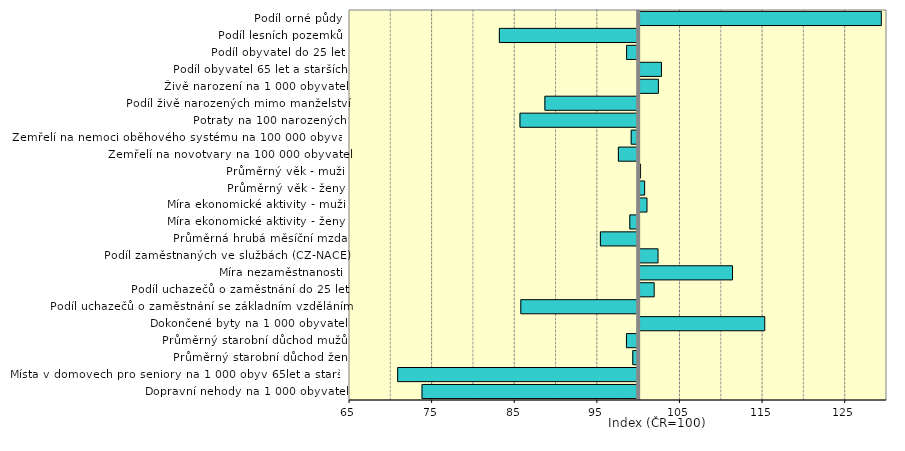
| Category | Series 0 |
|---|---|
| Dopravní nehody na 1 000 obyvatel | 73.778 |
| Místa v domovech pro seniory na 1 000 obyv 65let a starších | 70.829 |
| Průměrný starobní důchod žen | 99.29 |
| Průměrný starobní důchod mužů | 98.523 |
| Dokončené byty na 1 000 obyvatel | 115.201 |
| Podíl uchazečů o zaměstnání se základním vzděláním | 85.737 |
| Podíl uchazečů o zaměstnání do 25 let | 101.82 |
| Míra nezaměstnanosti | 111.3 |
| Podíl zaměstnaných ve službách (CZ-NACE) | 102.285 |
| Průměrná hrubá měsíční mzda | 95.369 |
| Míra ekonomické aktivity - ženy | 98.931 |
| Míra ekonomické aktivity - muži | 100.948 |
| Průměrný věk - ženy | 100.665 |
| Průměrný věk - muži | 100.17 |
| Zemřelí na novotvary na 100 000 obyvatel | 97.547 |
| Zemřelí na nemoci oběhového systému na 100 000 obyvatel | 99.097 |
| Potraty na 100 narozených | 85.635 |
| Podíl živě narozených mimo manželství | 88.652 |
| Živě narození na 1 000 obyvatel | 102.328 |
| Podíl obyvatel 65 let a starších | 102.702 |
| Podíl obyvatel do 25 let | 98.542 |
| Podíl lesních pozemků | 83.14 |
| Podíl orné půdy | 129.313 |